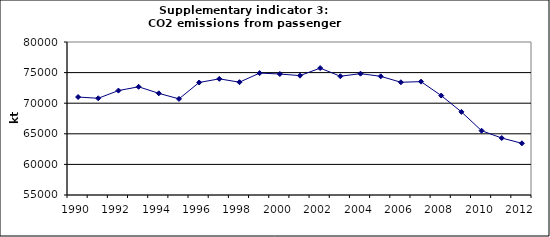
| Category | CO2 emissions from passenger cars, kt |
|---|---|
| 1990 | 71007.031 |
| 1991 | 70806.125 |
| 1992 | 72061.06 |
| 1993 | 72680.985 |
| 1994 | 71611.353 |
| 1995 | 70704.831 |
| 1996 | 73384.339 |
| 1997 | 73979.545 |
| 1998 | 73433.631 |
| 1999 | 74921.069 |
| 2000 | 74771.045 |
| 2001 | 74504.846 |
| 2002 | 75734.203 |
| 2003 | 74404.761 |
| 2004 | 74824.611 |
| 2005 | 74393.554 |
| 2006 | 73420.96 |
| 2007 | 73525.279 |
| 2008 | 71245.544 |
| 2009 | 68583.455 |
| 2010 | 65506.068 |
| 2011 | 64310.76 |
| 2012 | 63446.016 |